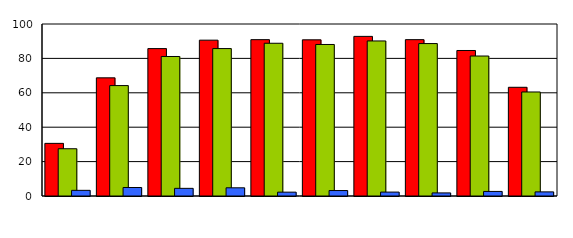
| Category | Series 0 | Series 1 | Series 2 |
|---|---|---|---|
| 0 | 30.6 | 27.473 | 3.297 |
| 1 | 68.7 | 64.198 | 4.938 |
| 2 | 85.7 | 81.111 | 4.444 |
| 3 | 90.6 | 85.714 | 4.762 |
| 4 | 90.9 | 88.806 | 2.239 |
| 5 | 90.8 | 88.095 | 3.175 |
| 6 | 92.8 | 90.152 | 2.273 |
| 7 | 90.9 | 88.623 | 1.796 |
| 8 | 84.6 | 81.383 | 2.66 |
| 9 | 63.2 | 60.479 | 2.395 |